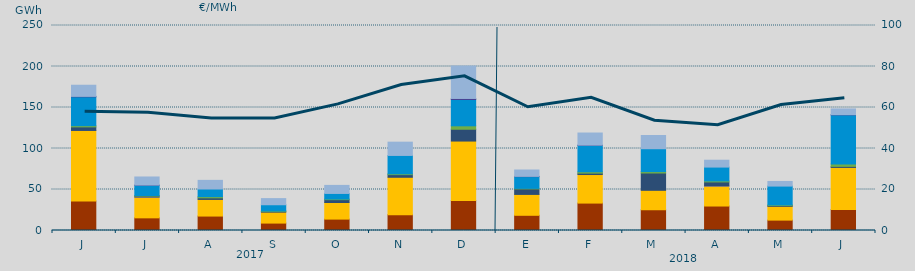
| Category | Carbón | Ciclo Combinado | Cogeneración | Consumo Bombeo | Eólica | Hidráulica | Nuclear | Turbinación bombeo |
|---|---|---|---|---|---|---|---|---|
| J | 35897.1 | 86103.9 | 16 | 4321.9 | 1499 | 35181.7 | 537 | 13587.3 |
| J | 15424.3 | 25298.7 | 6 | 1196.5 | 694.8 | 12560.8 | 231 | 9853.3 |
| A | 17604.1 | 20278.5 | 0 | 1953.7 | 1479 | 9282.6 | 0 | 10537.6 |
| S | 9030.9 | 13355.9 | 0 | 972.7 | 456.9 | 7586.6 | 0 | 7497.3 |
| O | 13899.2 | 20227.3 | 0 | 3473.9 | 731.2 | 6859.3 | 0 | 9809.3 |
| N | 19298.3 | 45604 | 0 | 3226 | 983.4 | 22432 | 0 | 16186.5 |
| D | 36464.5 | 72616.8 | 0 | 14393.3 | 4195.1 | 32118.7 | 1236 | 39485.4 |
| E | 18538.8 | 25466.6 | 0 | 6696 | 686 | 14339.3 | 277 | 7767.7 |
| F | 33434.8 | 34817.7 | 0 | 1704 | 1654.6 | 32219.8 | 258 | 14790.9 |
| M | 25308.3 | 23702.3 | 0 | 21100.1 | 1712.3 | 27908.3 | 0 | 16090.2 |
| A | 29845.7 | 24356.1 | 74 | 4947.9 | 1233.1 | 16888.6 | 0 | 8367.7 |
| M | 12672 | 16812.4 | 0 | 952.5 | 730.5 | 23001.2 | 0 | 5631.5 |
| J | 25536.3 | 51382.8 | 0 | 1275.4 | 2784.2 | 59979.3 | 310 | 6998.5 |